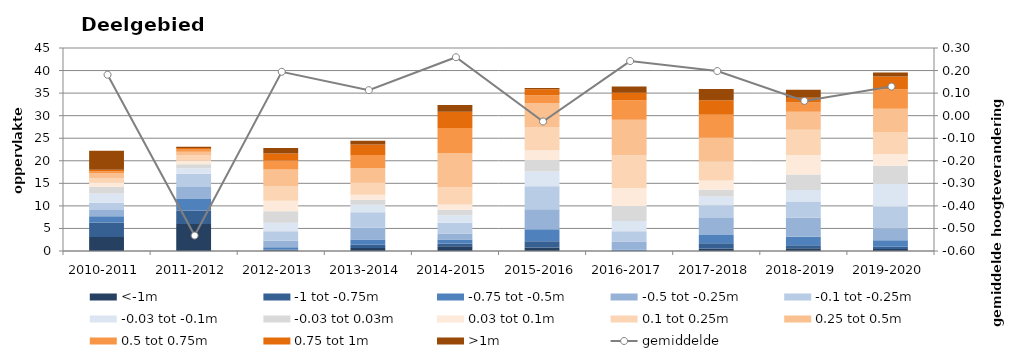
| Category | <-1m | -1 tot -0.75m | -0.75 tot -0.5m | -0.5 tot -0.25m | -0.1 tot -0.25m | -0.03 tot -0.1m | -0.03 tot 0.03m | 0.03 tot 0.1m | 0.1 tot 0.25m | 0.25 tot 0.5m | 0.5 tot 0.75m | 0.75 tot 1m | >1m |
|---|---|---|---|---|---|---|---|---|---|---|---|---|---|
| 2010-2011 | 3.111 | 3.186 | 1.413 | 1.364 | 1.611 | 2.074 | 1.452 | 0.89 | 1.014 | 1.132 | 0.418 | 0.363 | 4.203 |
| 2011-2012 | 5.972 | 3.022 | 2.507 | 2.686 | 2.922 | 1.24 | 0.861 | 0.818 | 1.128 | 0.863 | 0.467 | 0.322 | 0.281 |
| 2012-2013 | 0.147 | 0.204 | 0.496 | 1.432 | 2.094 | 1.904 | 2.532 | 2.343 | 3.196 | 3.712 | 1.993 | 1.58 | 1.206 |
| 2013-2014 | 0.653 | 0.707 | 1.194 | 2.599 | 3.451 | 1.638 | 1.105 | 1.134 | 2.633 | 3.312 | 2.832 | 2.355 | 0.818 |
| 2014-2015 | 1.041 | 0.624 | 0.885 | 1.342 | 2.397 | 1.66 | 1.21 | 1.131 | 3.881 | 7.553 | 5.517 | 3.652 | 1.485 |
| 2015-2016 | 0.777 | 1.39 | 2.68 | 4.39 | 5.142 | 3.258 | 2.52 | 2.201 | 5.035 | 5.392 | 1.765 | 1.312 | 0.294 |
| 2016-2017 | 0 | 0.006 | 0.278 | 1.799 | 2.305 | 2.263 | 3.32 | 4.022 | 7.238 | 7.854 | 4.324 | 1.664 | 1.372 |
| 2017-2018 | 0.549 | 1.142 | 1.835 | 3.81 | 2.753 | 1.97 | 1.518 | 2.06 | 4.186 | 5.29 | 5.087 | 3.205 | 2.504 |
| 2018-2019 | 0.582 | 0.714 | 1.858 | 4.222 | 3.594 | 2.538 | 3.456 | 4.315 | 5.572 | 4.024 | 2.035 | 1.085 | 1.726 |
| 2019-2020 | 0.469 | 0.473 | 1.45 | 2.622 | 4.824 | 5.002 | 4.074 | 2.564 | 4.902 | 5.164 | 4.328 | 2.793 | 0.925 |